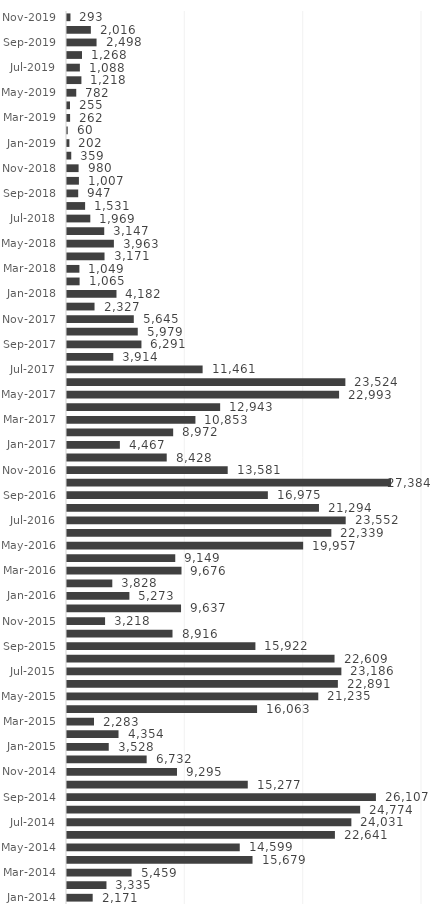
| Category | Series 0 |
|---|---|
| Jan-2014 | 2171 |
| Feb-2014 | 3335 |
| Mar-2014 | 5459 |
| Apr-2014 | 15679 |
| May-2014 | 14599 |
| Jun-2014 | 22641 |
| Jul-2014 | 24031 |
| Aug-2014 | 24774 |
| Sep-2014 | 26107 |
| Oct-2014 | 15277 |
| Nov-2014 | 9295 |
| Dec-2014 | 6732 |
| Jan-2015 | 3528 |
| Feb-2015 | 4354 |
| Mar-2015 | 2283 |
| Apr-2015 | 16063 |
| May-2015 | 21235 |
| Jun-2015 | 22891 |
| Jul-2015 | 23186 |
| Aug-2015 | 22609 |
| Sep-2015 | 15922 |
| Oct-2015 | 8916 |
| Nov-2015 | 3218 |
| Dec-2015 | 9637 |
| Jan-2016 | 5273 |
| Feb-2016 | 3828 |
| Mar-2016 | 9676 |
| Apr-2016 | 9149 |
| May-2016 | 19957 |
| Jun-2016 | 22339 |
| Jul-2016 | 23552 |
| Aug-2016 | 21294 |
| Sep-2016 | 16975 |
| Oct-2016 | 27384 |
| Nov-2016 | 13581 |
| Dec-2016 | 8428 |
| Jan-2017 | 4467 |
| Feb-2017 | 8972 |
| Mar-2017 | 10853 |
| Apr-2017 | 12943 |
| May-2017 | 22993 |
| Jun-2017 | 23524 |
| Jul-2017 | 11461 |
| Aug-2017 | 3914 |
| Sep-2017 | 6291 |
| Oct-2017 | 5979 |
| Nov-2017 | 5645 |
| Dec-2017 | 2327 |
| Jan-2018 | 4182 |
| Feb-2018 | 1065 |
| Mar-2018 | 1049 |
| Apr-2018 | 3171 |
| May-2018 | 3963 |
| Jun-2018 | 3147 |
| Jul-2018 | 1969 |
| Aug-2018 | 1531 |
| Sep-2018 | 947 |
| Oct-2018 | 1007 |
| Nov-2018 | 980 |
| Dec-2018 | 359 |
| Jan-2019 | 202 |
| Feb-2019 | 60 |
| Mar-2019 | 262 |
| Apr-2019 | 255 |
| May-2019 | 782 |
| Jun-2019 | 1218 |
| Jul-2019 | 1088 |
| Aug-2019 | 1268 |
| Sep-2019 | 2498 |
| Oct-2019 | 2016 |
| Nov-2019 | 293 |